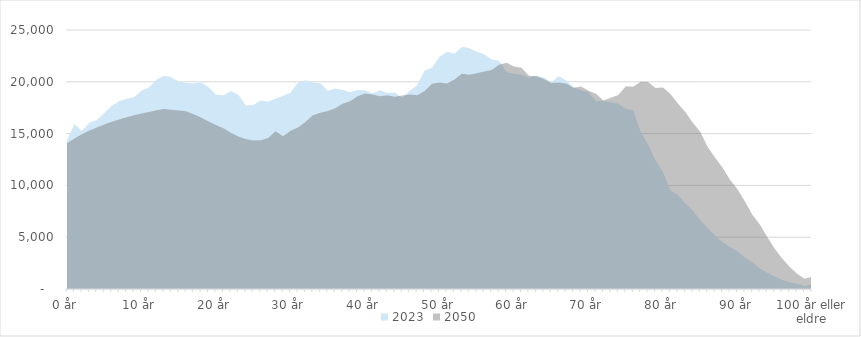
| Category | 2023 | 2050 |
|---|---|---|
| 0 år | 14348 | 14063 |
| 1 år | 15918 | 14534 |
| 2 år | 15245 | 14938 |
| 3 år | 16036 | 15289 |
| 4 år | 16306 | 15599 |
| 5 år | 16978 | 15876 |
| 6 år | 17679 | 16136 |
| 7 år | 18117 | 16370 |
| 8 år | 18372 | 16581 |
| 9 år | 18518 | 16768 |
| 10 år | 19129 | 16943 |
| 11 år | 19444 | 17094 |
| 12 år | 20195 | 17252 |
| 13 år | 20595 | 17384 |
| 14 år | 20437 | 17308 |
| 15 år | 20031 | 17219 |
| 16 år | 19892 | 17161 |
| 17 år | 19836 | 16877 |
| 18 år | 19967 | 16549 |
| 19 år | 19486 | 16164 |
| 20 år | 18752 | 15820 |
| 21 år | 18690 | 15517 |
| 22 år | 19124 | 15074 |
| 23 år | 18756 | 14727 |
| 24 år | 17705 | 14473 |
| 25 år | 17758 | 14330 |
| 26 år | 18207 | 14365 |
| 27 år | 18089 | 14581 |
| 28 år | 18359 | 15216 |
| 29 år | 18664 | 14755 |
| 30 år | 18953 | 15280 |
| 31 år | 19914 | 15585 |
| 32 år | 20144 | 16126 |
| 33 år | 19923 | 16781 |
| 34 år | 19863 | 17016 |
| 35 år | 19136 | 17176 |
| 36 år | 19357 | 17446 |
| 37 år | 19207 | 17879 |
| 38 år | 18983 | 18122 |
| 39 år | 19203 | 18596 |
| 40 år | 19175 | 18879 |
| 41 år | 18861 | 18784 |
| 42 år | 19190 | 18595 |
| 43 år | 18917 | 18710 |
| 44 år | 18964 | 18547 |
| 45 år | 18458 | 18684 |
| 46 år | 19123 | 18773 |
| 47 år | 19689 | 18700 |
| 48 år | 21061 | 19101 |
| 49 år | 21380 | 19803 |
| 50 år | 22420 | 19933 |
| 51 år | 22898 | 19841 |
| 52 år | 22707 | 20221 |
| 53 år | 23372 | 20775 |
| 54 år | 23241 | 20681 |
| 55 år | 22911 | 20824 |
| 56 år | 22665 | 20990 |
| 57 år | 22160 | 21150 |
| 58 år | 22042 | 21641 |
| 59 år | 20956 | 21841 |
| 60 år | 20769 | 21485 |
| 61 år | 20688 | 21363 |
| 62 år | 20391 | 20572 |
| 63 år | 20609 | 20540 |
| 64 år | 20407 | 20265 |
| 65 år | 19960 | 19888 |
| 66 år | 20527 | 19928 |
| 67 år | 20155 | 19824 |
| 68 år | 19477 | 19414 |
| 69 år | 19174 | 19551 |
| 70 år | 19008 | 19139 |
| 71 år | 18132 | 18849 |
| 72 år | 18180 | 18185 |
| 73 år | 18006 | 18462 |
| 74 år | 17880 | 18736 |
| 75 år | 17394 | 19579 |
| 76 år | 17238 | 19513 |
| 77 år | 15187 | 19995 |
| 78 år | 13932 | 19971 |
| 79 år | 12408 | 19410 |
| 80 år | 11305 | 19441 |
| 81 år | 9527 | 18820 |
| 82 år | 9068 | 17907 |
| 83 år | 8263 | 17084 |
| 84 år | 7568 | 16055 |
| 85 år | 6639 | 15176 |
| 86 år | 5879 | 13696 |
| 87 år | 5134 | 12668 |
| 88 år | 4522 | 11713 |
| 89 år | 4030 | 10540 |
| 90 år | 3647 | 9632 |
| 91 år | 3017 | 8442 |
| 92 år | 2548 | 7162 |
| 93 år | 1977 | 6233 |
| 94 år | 1566 | 5031 |
| 95 år | 1215 | 3886 |
| 96 år | 872 | 2943 |
| 97 år | 651 | 2157 |
| 98 år | 499 | 1471 |
| 99 år | 288 | 990 |
| 100 år eller eldre | 459 | 1188 |